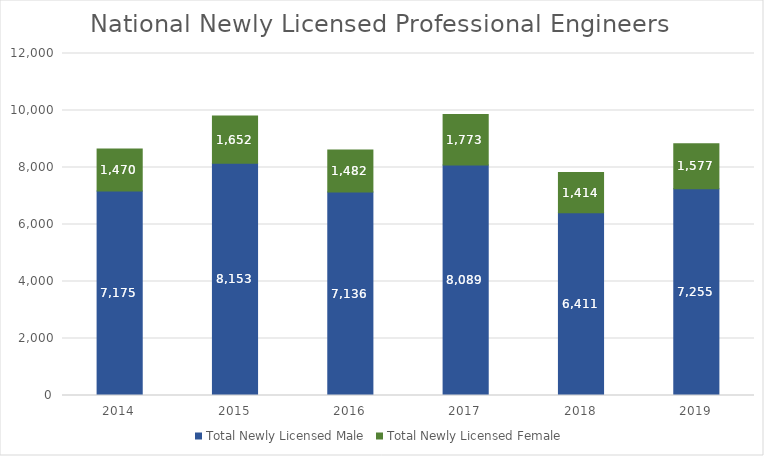
| Category | Total Newly Licensed Male | Total Newly Licensed Female |
|---|---|---|
| 2014.0 | 7175 | 1470 |
| 2015.0 | 8153 | 1652 |
| 2016.0 | 7136 | 1482 |
| 2017.0 | 8089 | 1773 |
| 2018.0 | 6411 | 1414 |
| 2019.0 | 7255 | 1577 |